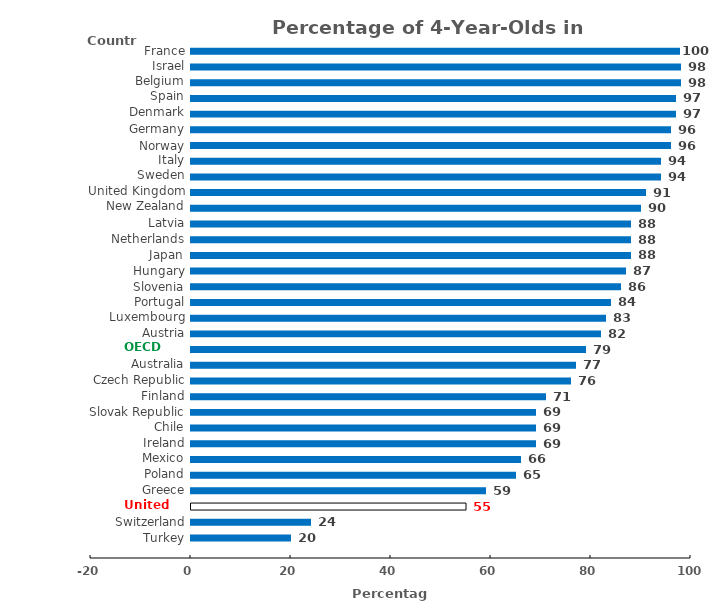
| Category | Percentage | sss |
|---|---|---|
| Biff | 0 | -0.25 |
| Turkey | 20 | -0.25 |
| Switzerland | 24 | -0.25 |
| United States | 55 | -0.25 |
| Greece | 59 | -0.25 |
| Poland | 65 | -0.25 |
| Mexico | 66 | -0.25 |
| Ireland | 69 | -0.25 |
| Chile | 69 | -0.25 |
| Slovak Republic | 69 | -0.25 |
| Finland | 71 | -0.25 |
| Czech Republic | 76 | -0.25 |
| Australia | 77 | -0.25 |
| OECD average | 79 | -0.25 |
| Austria | 82 | -0.25 |
| Luxembourg | 83 | -0.25 |
| Portugal | 84 | -0.25 |
| Slovenia | 86 | -0.25 |
| Hungary | 87 | -0.25 |
| Japan | 88 | -0.25 |
| Netherlands | 88 | -0.25 |
| Latvia | 88 | -0.25 |
| New Zealand | 90 | -0.25 |
| United Kingdom | 91 | -0.25 |
| Sweden | 94 | -0.25 |
| Italy | 94 | -0.25 |
| Norway | 96 | -0.25 |
| Germany | 96 | -0.25 |
| Denmark | 97 | -0.25 |
| Spain | 97 | -0.25 |
| Belgium | 98 | -0.25 |
| Israel | 98 | -0.25 |
| France | 100 | -0.25 |